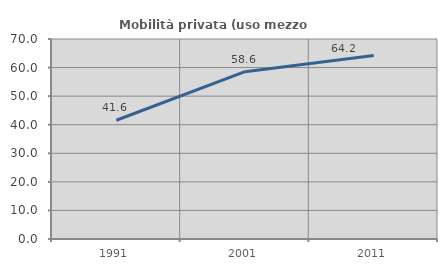
| Category | Mobilità privata (uso mezzo privato) |
|---|---|
| 1991.0 | 41.566 |
| 2001.0 | 58.563 |
| 2011.0 | 64.225 |